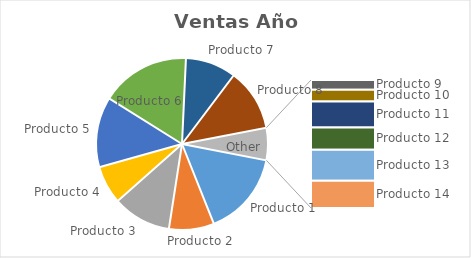
| Category | Ventas Año 2013 |
|---|---|
| Producto 1 | 6512 |
| Producto 2 | 3480 |
| Producto 3 | 4510 |
| Producto 4 | 2940 |
| Producto 5 | 5430 |
| Producto 6 | 6900 |
| Producto 7 | 3910 |
| Producto 8 | 4780 |
| Producto 9 | 190 |
| Producto 10 | 230 |
| Producto 11 | 510 |
| Producto 12 | 430 |
| Producto 13 | 610 |
| Producto 14 | 530 |